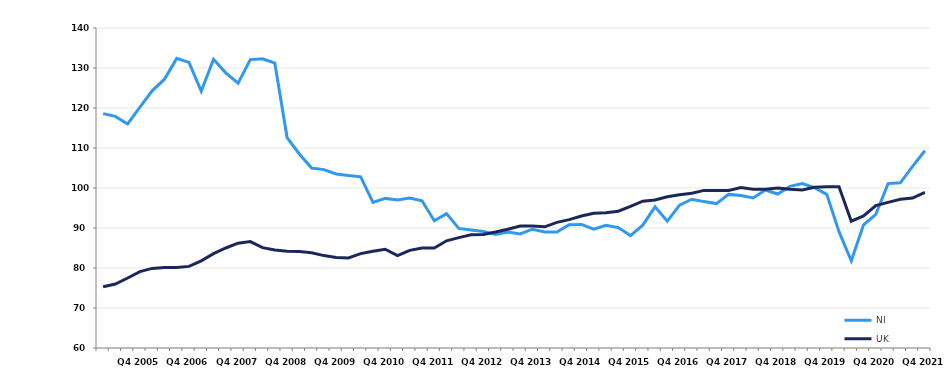
| Category | NI | UK |
|---|---|---|
|  | 118.6 | 75.3 |
|  | 117.9 | 76 |
|  | 116 | 77.5 |
| Q4 2005 | 120.2 | 79.1 |
|  | 124.3 | 79.9 |
|  | 127.2 | 80.1 |
|  | 132.4 | 80.1 |
| Q4 2006 | 131.4 | 80.4 |
|  | 124.2 | 81.8 |
|  | 132.2 | 83.6 |
|  | 128.8 | 85 |
| Q4 2007 | 126.2 | 86.2 |
|  | 132.1 | 86.6 |
|  | 132.3 | 85.1 |
|  | 131.2 | 84.5 |
| Q4 2008 | 112.6 | 84.2 |
|  | 108.5 | 84.1 |
|  | 105 | 83.8 |
|  | 104.6 | 83.1 |
| Q4 2009 | 103.5 | 82.6 |
|  | 103.1 | 82.5 |
|  | 102.8 | 83.6 |
|  | 96.4 | 84.2 |
| Q4 2010 | 97.4 | 84.7 |
|  | 97 | 83.1 |
|  | 97.5 | 84.4 |
|  | 96.8 | 85 |
| Q4 2011 | 91.8 | 85 |
|  | 93.6 | 86.8 |
|  | 89.9 | 87.6 |
|  | 89.5 | 88.3 |
| Q4 2012 | 89.1 | 88.4 |
|  | 88.4 | 89 |
|  | 89 | 89.7 |
|  | 88.5 | 90.5 |
| Q4 2013 | 89.7 | 90.5 |
|  | 89 | 90.3 |
|  | 89 | 91.4 |
|  | 90.8 | 92.1 |
| Q4 2014 | 90.9 | 93 |
|  | 89.7 | 93.7 |
|  | 90.7 | 93.8 |
|  | 90.1 | 94.2 |
| Q4 2015 | 88.1 | 95.4 |
|  | 90.7 | 96.7 |
|  | 95.3 | 97 |
|  | 91.7 | 97.8 |
| Q4 2016 | 95.7 | 98.3 |
|  | 97.2 | 98.7 |
|  | 96.6 | 99.4 |
|  | 96.1 | 99.4 |
| Q4 2017 | 98.4 | 99.4 |
|  | 98.1 | 100.1 |
|  | 97.5 | 99.7 |
|  | 99.5 | 99.7 |
| Q4 2018 | 98.5 | 100 |
|  | 100.4 | 99.7 |
|  | 101.1 | 99.5 |
|  | 100.1 | 100.2 |
| Q4 2019 | 98.4 | 100.3 |
|  | 89.1 | 100.3 |
|  | 81.8 | 91.7 |
|  | 90.8 | 93 |
| Q4 2020 | 93.4 | 95.6 |
|  | 101.1 | 96.4 |
|  | 101.3 | 97.2 |
|  | 105.4 | 97.5 |
| Q4 2021 | 109.3 | 98.9 |